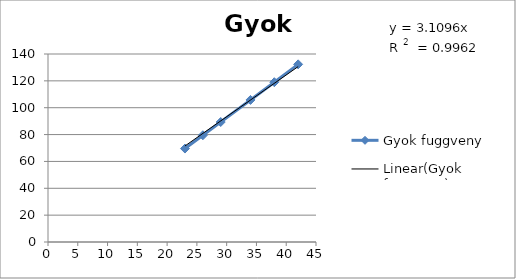
| Category | Gyok fuggveny |
|---|---|
| 23.0 | 69.591 |
| 26.0 | 79.488 |
| 29.0 | 89.334 |
| 34.0 | 105.789 |
| 38.0 | 118.993 |
| 42.0 | 132.283 |